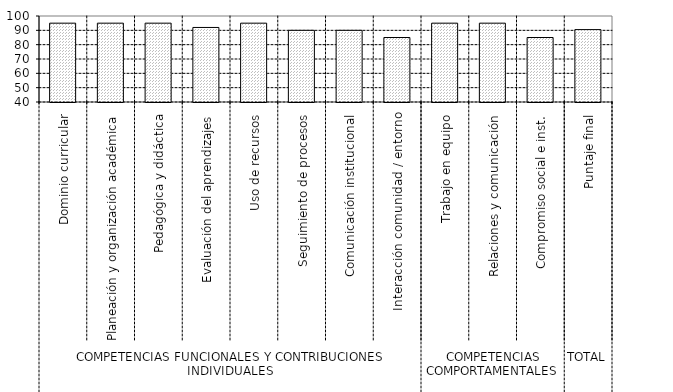
| Category | Series 0 |
|---|---|
| 0 | 95 |
| 1 | 95 |
| 2 | 95 |
| 3 | 92 |
| 4 | 95 |
| 5 | 90 |
| 6 | 90 |
| 7 | 85 |
| 8 | 95 |
| 9 | 95 |
| 10 | 85 |
| 11 | 90.512 |